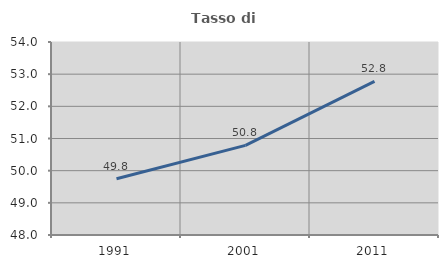
| Category | Tasso di occupazione   |
|---|---|
| 1991.0 | 49.751 |
| 2001.0 | 50.786 |
| 2011.0 | 52.775 |